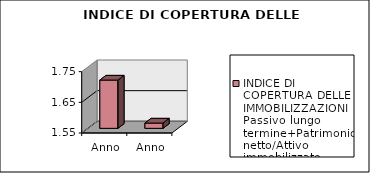
| Category | INDICE DI COPERTURA DELLE IMMOBILIZZAZIONI
Passivo lungo termine+Patrimonio netto/Attivo immobilizzato |
|---|---|
| Anno 2023 | 1.707 |
| Anno 2022 | 1.567 |